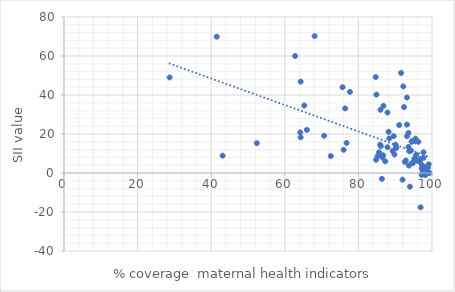
| Category | SII |
|---|---|
| 89.8 | 9.5 |
| 97.3 | 4 |
| 87.9 | 13.2 |
| 99.3 | 0 |
| 70.7 | 19.1 |
| 96.9 | -17.6 |
| 98.9 | 2.8 |
| 92.6 | 5.7 |
| 97.2 | -1 |
| 66.0 | 22.1 |
| 96.7 | 5.8 |
| 96.8 | 7.3 |
| 89.6 | 18.9 |
| 93.8 | 11.2 |
| 86.5 | 8 |
| 96.3 | 16 |
| 90.2 | 13.5 |
| 94.0 | -7 |
| 89.3 | 11.3 |
| 98.4 | 3.1 |
| 92.9 | 6.4 |
| 97.2 | 2.4 |
| 85.2 | 8.6 |
| 94.5 | 5 |
| 98.7 | 0.9 |
| 88.2 | 21.1 |
| 91.1 | 24.6 |
| 90.1 | 14.5 |
| 94.8 | 5.1 |
| 84.8 | 6.8 |
| 93.7 | 3.8 |
| 97.7 | 7.8 |
| 85.9 | 14.5 |
| 62.8 | 60 |
| 65.3 | 34.6 |
| 77.7 | 41.6 |
| 68.1 | 70.2 |
| 86.7 | 9.1 |
| 93.6 | 20.5 |
| 52.4 | 15.3 |
| 93.2 | 24.8 |
| 92.4 | 33.8 |
| 64.3 | 46.9 |
| 75.7 | 44 |
| 43.1 | 8.9 |
| 28.7 | 49 |
| 41.5 | 69.9 |
| 88.4 | 17.7 |
| 86.0 | 32.4 |
| 76.0 | 11.9 |
| 84.9 | 40.2 |
| 84.7 | 49.2 |
| 85.6 | 10.6 |
| 97.4 | 1.4 |
| 99.1 | 4.5 |
| 94.3 | 11.5 |
| 90.3 | 12.8 |
| 86.1 | 13.8 |
| 95.2 | 7.4 |
| 97.7 | 10.6 |
| 87.9 | 31 |
| 86.8 | 34.4 |
| 76.4 | 33.1 |
| 92.2 | 44.4 |
| 91.6 | 51.3 |
| 93.6 | 13.4 |
| 94.5 | 16 |
| 86.4 | -3 |
| 94.5 | 16.3 |
| 95.5 | 17.6 |
| 95.7 | 9.3 |
| 93.2 | 18.9 |
| 64.2 | 20.8 |
| 95.5 | 16.2 |
| 93.2 | 38.7 |
| 95.9 | 6.3 |
| 72.5 | 8.7 |
| 87.3 | 6 |
| 97.7 | 0.8 |
| 64.3 | 18.3 |
| 92.0 | -3.4 |
| 98.0 | 1.9 |
| 76.8 | 15.4 |
| 98.1 | 1.6 |
| 98.2 | -1.1 |